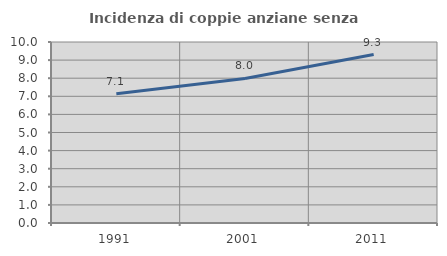
| Category | Incidenza di coppie anziane senza figli  |
|---|---|
| 1991.0 | 7.141 |
| 2001.0 | 7.986 |
| 2011.0 | 9.309 |